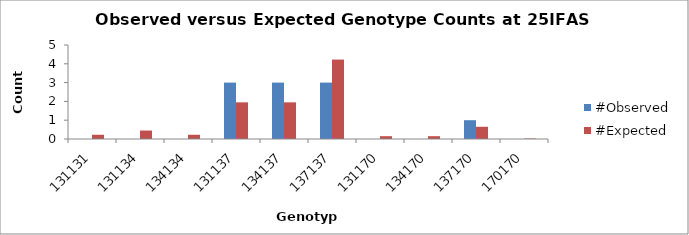
| Category | #Observed | #Expected |
|---|---|---|
| 131131.0 | 0 | 0.225 |
| 131134.0 | 0 | 0.45 |
| 134134.0 | 0 | 0.225 |
| 131137.0 | 3 | 1.95 |
| 134137.0 | 3 | 1.95 |
| 137137.0 | 3 | 4.225 |
| 131170.0 | 0 | 0.15 |
| 134170.0 | 0 | 0.15 |
| 137170.0 | 1 | 0.65 |
| 170170.0 | 0 | 0.025 |